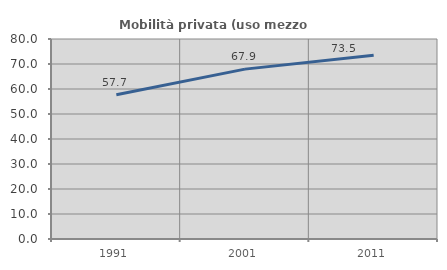
| Category | Mobilità privata (uso mezzo privato) |
|---|---|
| 1991.0 | 57.728 |
| 2001.0 | 67.947 |
| 2011.0 | 73.49 |